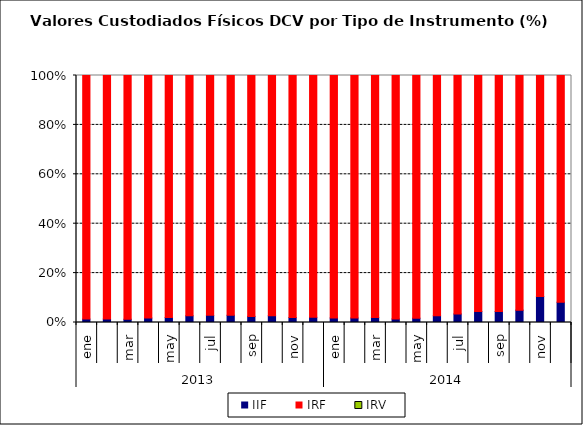
| Category | IIF | IRF | IRV |
|---|---|---|---|
| 0 | 246.058 | 17675.595 | 0 |
| 1 | 248.565 | 17532.262 | 0 |
| 2 | 232.11 | 17463.557 | 0 |
| 3 | 320.19 | 17402.88 | 0 |
| 4 | 331.514 | 16284.137 | 0 |
| 5 | 443.085 | 15875.554 | 0 |
| 6 | 459.473 | 15456.318 | 0 |
| 7 | 470.581 | 15551.62 | 0 |
| 8 | 395.425 | 15589.918 | 0 |
| 9 | 429.465 | 15403.335 | 0 |
| 10 | 300.401 | 14688.927 | 0 |
| 11 | 313.525 | 14689.453 | 0 |
| 12 | 262.522 | 13801.442 | 0 |
| 13 | 240.521 | 12950.356 | 0 |
| 14 | 268.964 | 13115.671 | 0 |
| 15 | 189.002 | 12817.695 | 0 |
| 16 | 233.226 | 13150.445 | 0 |
| 17 | 362.428 | 12967.474 | 0 |
| 18 | 444.215 | 12353.018 | 0 |
| 19 | 549.81 | 11919.356 | 0 |
| 20 | 544.517 | 11679.684 | 0 |
| 21 | 637.749 | 12095.534 | 0 |
| 22 | 1381.042 | 11744.065 | 0 |
| 23 | 1019.147 | 11387.8 | 0 |